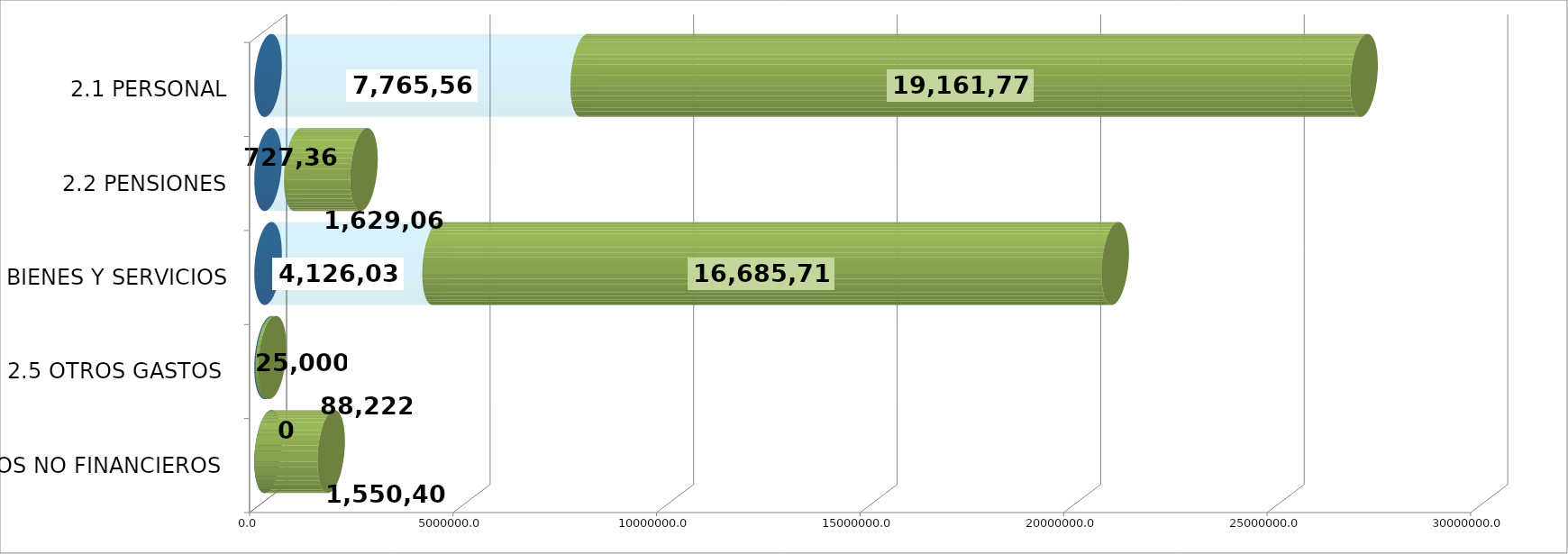
| Category | GENERICA | EJECUTADO | SALDO  |
|---|---|---|---|
| 2.1 PERSONAL | 0 | 7765559.64 | 19161773.36 |
| 2.2 PENSIONES | 0 | 727361.44 | 1629060.56 |
| 2.3 BIENES Y SERVICIOS | 0 | 4126032.54 | 16685718.46 |
| 2.5 OTROS GASTOS  | 0 | 25000 | 88222 |
| 2.6 ACTIVOS NO FINANCIEROS  | 0 | 0 | 1550406 |